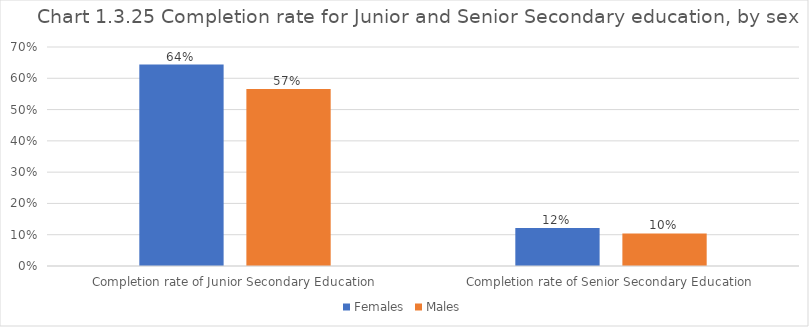
| Category | Females | Males |
|---|---|---|
| Completion rate of Junior Secondary Education | 0.644 | 0.566 |
| Completion rate of Senior Secondary Education | 0.122 | 0.104 |